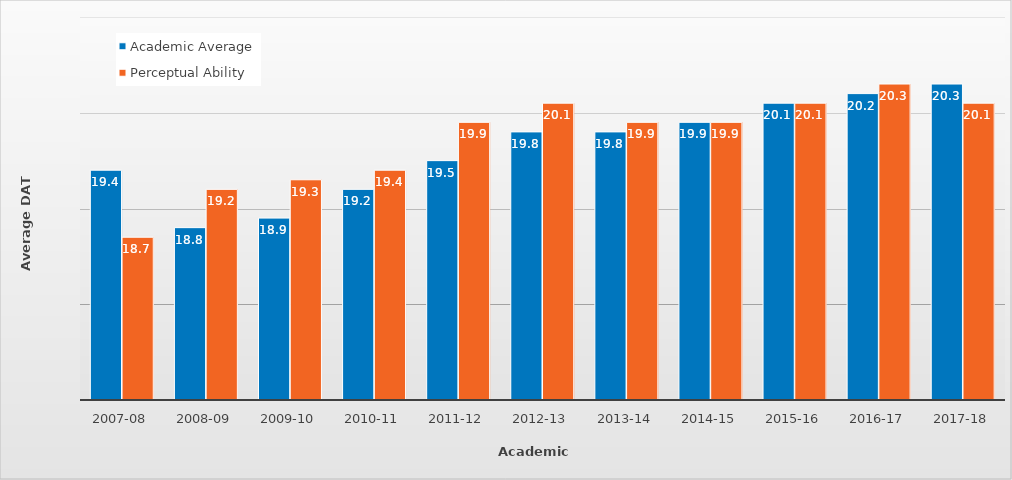
| Category | Academic Average | Perceptual Ability |
|---|---|---|
| 2007-08 | 19.4 | 18.7 |
| 2008-09 | 18.8 | 19.2 |
| 2009-10 | 18.9 | 19.3 |
| 2010-11 | 19.2 | 19.4 |
| 2011-12 | 19.5 | 19.9 |
| 2012-13 | 19.8 | 20.1 |
| 2013-14 | 19.8 | 19.9 |
| 2014-15 | 19.9 | 19.9 |
| 2015-16 | 20.1 | 20.1 |
| 2016-17 | 20.2 | 20.3 |
| 2017-18 | 20.3 | 20.1 |